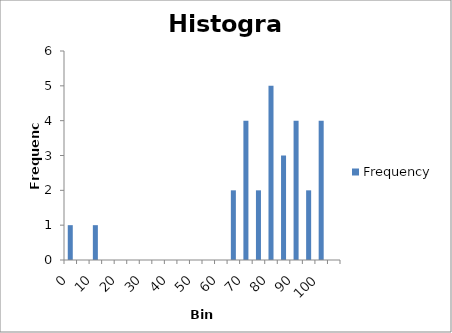
| Category | Frequency |
|---|---|
| 0 | 1 |
| 5 | 0 |
| 10 | 1 |
| 15 | 0 |
| 20 | 0 |
| 25 | 0 |
| 30 | 0 |
| 35 | 0 |
| 40 | 0 |
| 45 | 0 |
| 50 | 0 |
| 55 | 0 |
| 60 | 0 |
| 65 | 2 |
| 70 | 4 |
| 75 | 2 |
| 80 | 5 |
| 85 | 3 |
| 90 | 4 |
| 95 | 2 |
| 100 | 4 |
| More | 0 |